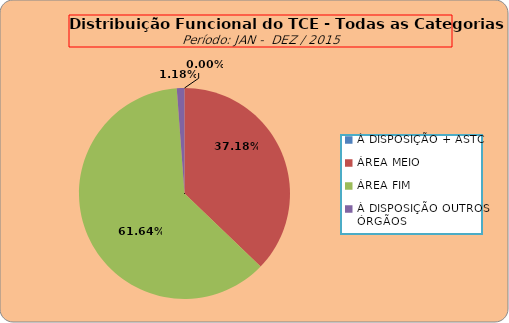
| Category | Series 0 |
|---|---|
| À DISPOSIÇÃO + ASTC | 0 |
| ÁREA MEIO | 190 |
| ÁREA FIM | 315 |
| À DISPOSIÇÃO OUTROS ÓRGÃOS | 6 |